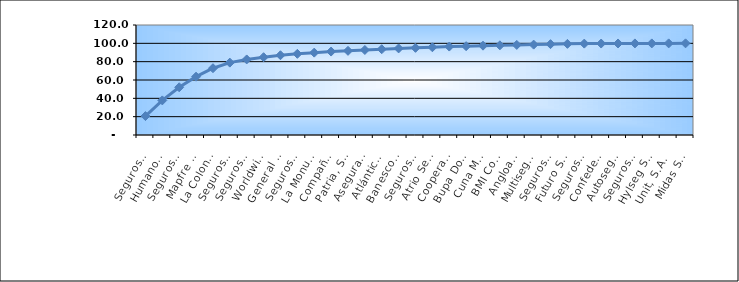
| Category | Series 0 |
|---|---|
| Seguros Universal, S. A. | 20.647 |
| Humano Seguros, S. A. | 37.75 |
| Seguros Reservas, S. A. | 52.068 |
| Mapfre BHD Compañía de Seguros | 63.631 |
| La Colonial, S. A., Compañia De Seguros | 72.867 |
| Seguros Sura, S.A. | 78.971 |
| Seguros Crecer, S. A. | 82.422 |
| Worldwide Seguros, S. A. | 84.883 |
| General de Seguros, S. A. | 87.005 |
| Seguros Pepín, S. A. | 88.541 |
| La Monumental de Seguros, S. A. | 89.858 |
| Compañía Dominicana de Seguros, C. por A. | 91.033 |
| Patria, S. A., Compañía de Seguros | 91.815 |
| Aseguradora Agropecuaria Dominicana, S. A. | 92.757 |
| Atlántica Seguros, S. A. | 93.565 |
| Banesco Seguros | 94.477 |
| Seguros La Internacional, S. A. | 95.093 |
| Atrio Seguros S. A. | 95.726 |
| Cooperativa Nacional De Seguros, Inc  | 96.476 |
| Bupa Dominicana, S. A. | 96.891 |
| Cuna Mutual Insurance Society Dominicana | 97.46 |
| BMI Compañía de Seguros, S. A. | 97.84 |
| Angloamericana de Seguros, S. A. | 98.273 |
| Multiseguros Su, S.A. | 98.6 |
| Seguros APS, S.R.L. | 99.132 |
| Futuro Seguros | 99.431 |
| Seguros Ademi, S.A. | 99.684 |
| Confederación del Canadá Dominicana, S. A. | 99.782 |
| Autoseguro, S. A. | 99.843 |
| Seguros Yunen, S.A. | 99.905 |
| Hylseg Seguros S.A | 99.913 |
| Unit, S.A. | 99.952 |
| Midas Seguros, S.A. | 100 |